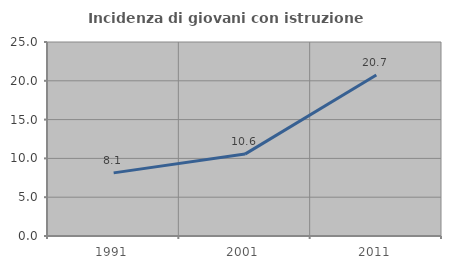
| Category | Incidenza di giovani con istruzione universitaria |
|---|---|
| 1991.0 | 8.136 |
| 2001.0 | 10.554 |
| 2011.0 | 20.74 |